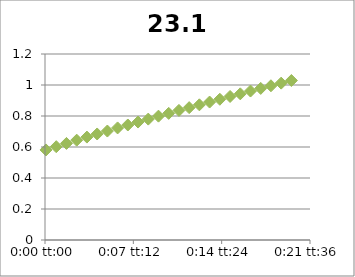
| Category | 23.1 |
|---|---|
| 5.78703703703704e-05 | 0.581 |
| 0.000636574074074074 | 0.602 |
| 0.00121527777777778 | 0.623 |
| 0.00179398148148148 | 0.644 |
| 0.00237268518518518 | 0.664 |
| 0.00295138888888889 | 0.684 |
| 0.00353009259259259 | 0.703 |
| 0.0041087962962963 | 0.723 |
| 0.0046875 | 0.742 |
| 0.0052662037037037 | 0.761 |
| 0.00584490740740741 | 0.78 |
| 0.00642361111111111 | 0.799 |
| 0.00700231481481481 | 0.817 |
| 0.00758101851851852 | 0.836 |
| 0.00815972222222222 | 0.854 |
| 0.00873842592592592 | 0.872 |
| 0.00931712962962963 | 0.89 |
| 0.00989583333333333 | 0.908 |
| 0.010474537037037 | 0.926 |
| 0.0110532407407407 | 0.943 |
| 0.0116319444444444 | 0.961 |
| 0.0122106481481481 | 0.978 |
| 0.0127893518518518 | 0.995 |
| 0.0133680555555556 | 1.012 |
| 0.0139467592592593 | 1.029 |